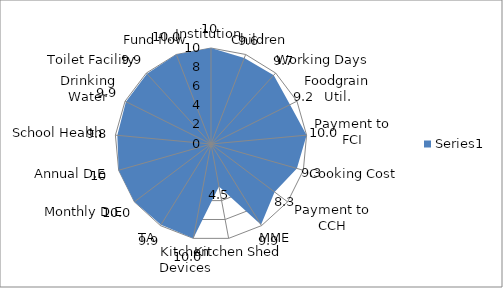
| Category | Series 0 |
|---|---|
| Institution | 10 |
| Children | 9.6 |
| Working Days | 9.7 |
| Foodgrain Util. | 9.2 |
| Payment to FCI | 10 |
| Cooking Cost | 9.3 |
| Payment to CCH | 8.3 |
| MME | 9.9 |
| Kitchen Shed | 4.5 |
| Kitchen Devices | 10 |
| TA | 9.9 |
| Monthly D.E | 10 |
| Annual D.E | 10 |
| School Health | 9.8 |
| Drinking Water | 9.9 |
| Toilet Facility  | 9.9 |
| Fund flow | 10 |